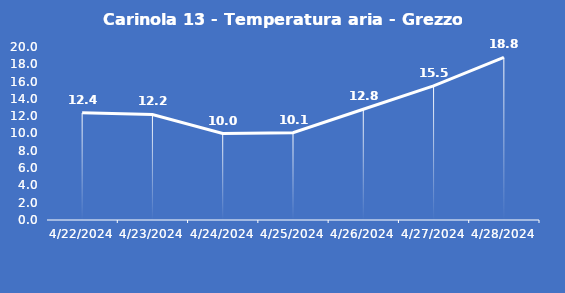
| Category | Carinola 13 - Temperatura aria - Grezzo (°C) |
|---|---|
| 4/22/24 | 12.4 |
| 4/23/24 | 12.2 |
| 4/24/24 | 10 |
| 4/25/24 | 10.1 |
| 4/26/24 | 12.8 |
| 4/27/24 | 15.5 |
| 4/28/24 | 18.8 |